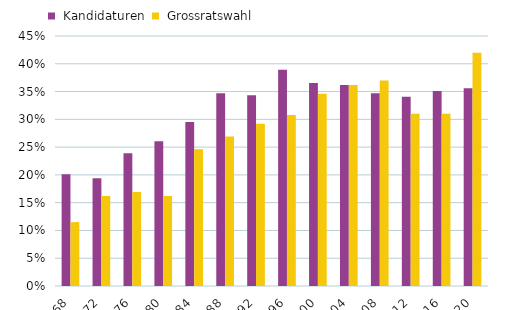
| Category |  Kandidaturen |  Grossratswahl |
|---|---|---|
| 1968 | 0.201 | 0.115 |
| 1972 | 0.194 | 0.162 |
| 1976 | 0.239 | 0.169 |
| 1980 | 0.261 | 0.162 |
| 1984 | 0.295 | 0.246 |
| 1988 | 0.347 | 0.269 |
| 1992 | 0.344 | 0.292 |
| 1996 | 0.389 | 0.308 |
| 2000 | 0.365 | 0.346 |
| 2004 | 0.362 | 0.362 |
| 2008 | 0.347 | 0.37 |
| 2012 | 0.341 | 0.31 |
| 2016 | 0.351 | 0.31 |
| 2020 | 0.356 | 0.42 |